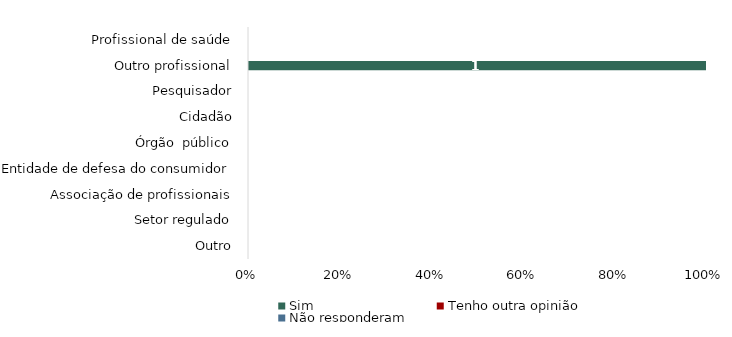
| Category | Sim | Tenho outra opinião | Não responderam |
|---|---|---|---|
| Outro | 0 | 0 | 0 |
| Setor regulado | 0 | 0 | 0 |
| Associação de profissionais | 0 | 0 | 0 |
| Entidade de defesa do consumidor | 0 | 0 | 0 |
| Órgão  público | 0 | 0 | 0 |
| Cidadão | 0 | 0 | 0 |
| Pesquisador | 0 | 0 | 0 |
| Outro profissional | 1 | 0 | 0 |
| Profissional de saúde | 0 | 0 | 0 |